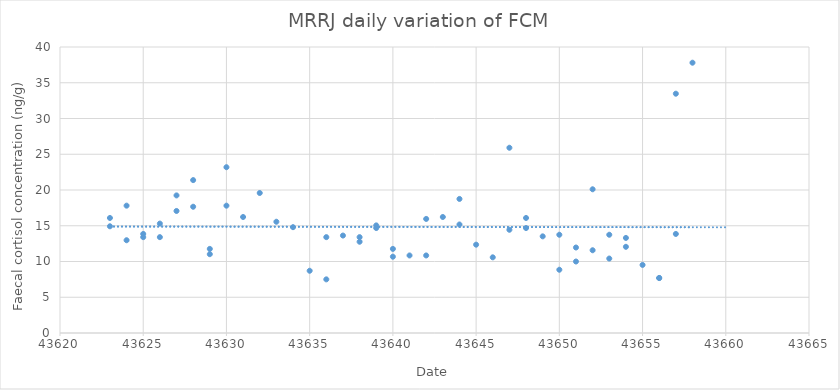
| Category | Series 0 |
|---|---|
| 43623.0 | 14.925 |
| 43623.0 | 16.089 |
| 43624.0 | 17.809 |
| 43624.0 | 12.974 |
| 43625.0 | 13.855 |
| 43625.0 | 13.407 |
| 43626.0 | 15.302 |
| 43626.0 | 13.407 |
| 43627.0 | 19.244 |
| 43627.0 | 17.067 |
| 43628.0 | 21.384 |
| 43628.0 | 17.658 |
| 43629.0 | 11.023 |
| 43629.0 | 11.764 |
| 43630.0 | 17.809 |
| 43630.0 | 23.188 |
| 43631.0 | 16.225 |
| 43632.0 | 19.581 |
| 43633.0 | 15.559 |
| 43634.0 | 14.802 |
| 43635.0 | 8.703 |
| 43636.0 | 7.502 |
| 43636.0 | 13.407 |
| 43637.0 | 13.629 |
| 43638.0 | 12.764 |
| 43638.0 | 13.407 |
| 43639.0 | 14.679 |
| 43639.0 | 15.049 |
| 43640.0 | 10.67 |
| 43640.0 | 11.764 |
| 43641.0 | 10.845 |
| 43642.0 | 15.955 |
| 43642.0 | 10.845 |
| 43643.0 | 16.225 |
| 43644.0 | 15.175 |
| 43644.0 | 18.75 |
| 43645.0 | 12.353 |
| 43646.0 | 10.584 |
| 43647.0 | 14.438 |
| 43647.0 | 25.91 |
| 43648.0 | 16.089 |
| 43648.0 | 14.679 |
| 43649.0 | 13.517 |
| 43650.0 | 13.741 |
| 43650.0 | 8.847 |
| 43651.0 | 9.998 |
| 43651.0 | 11.957 |
| 43652.0 | 11.574 |
| 43652.0 | 20.101 |
| 43653.0 | 13.741 |
| 43653.0 | 10.413 |
| 43654.0 | 13.297 |
| 43654.0 | 12.055 |
| 43655.0 | 9.522 |
| 43656.0 | 7.692 |
| 43656.0 | 7.692 |
| 43657.0 | 33.468 |
| 43657.0 | 13.855 |
| 43658.0 | 37.804 |